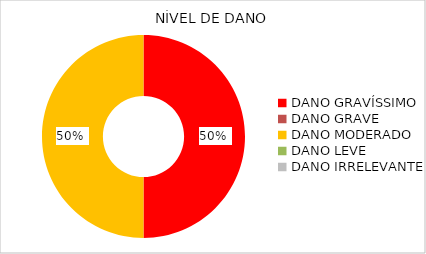
| Category | contagem |
|---|---|
| DANO GRAVÍSSIMO | 1 |
| DANO GRAVE | 0 |
| DANO MODERADO | 1 |
| DANO LEVE | 0 |
| DANO IRRELEVANTE | 0 |